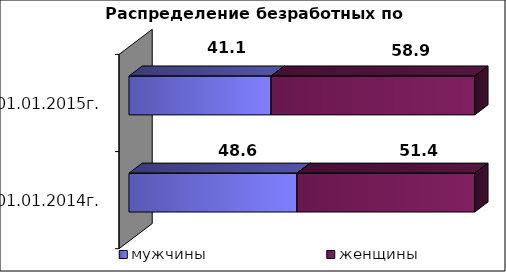
| Category | мужчины  | женщины  |
|---|---|---|
| на 01.01.2014г. | 48.6 | 51.4 |
| на 01.01.2015г. | 41.1 | 58.9 |